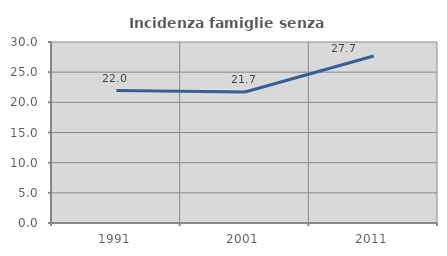
| Category | Incidenza famiglie senza nuclei |
|---|---|
| 1991.0 | 21.951 |
| 2001.0 | 21.719 |
| 2011.0 | 27.687 |